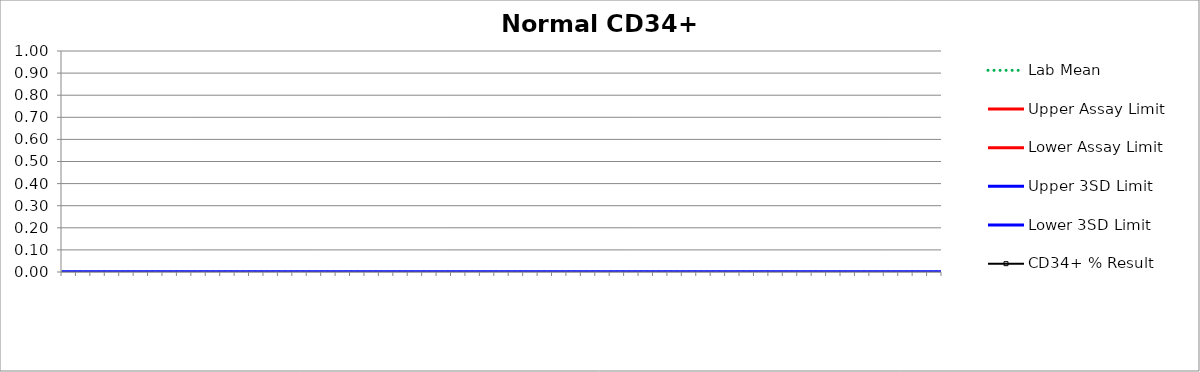
| Category | Lab Mean | Upper Assay Limit | Lower Assay Limit | Upper 3SD Limit | Lower 3SD Limit | CD34+ % Result |
|---|---|---|---|---|---|---|
|  | 0 |  |  | 0 | 0 |  |
|  | 0 |  |  | 0 | 0 |  |
|  | 0 |  |  | 0 | 0 |  |
|  | 0 |  |  | 0 | 0 |  |
|  | 0 |  |  | 0 | 0 |  |
|  | 0 |  |  | 0 | 0 |  |
|  | 0 |  |  | 0 | 0 |  |
|  | 0 |  |  | 0 | 0 |  |
|  | 0 |  |  | 0 | 0 |  |
|  | 0 |  |  | 0 | 0 |  |
|  | 0 |  |  | 0 | 0 |  |
|  | 0 |  |  | 0 | 0 |  |
|  | 0 |  |  | 0 | 0 |  |
|  | 0 |  |  | 0 | 0 |  |
|  | 0 |  |  | 0 | 0 |  |
|  | 0 |  |  | 0 | 0 |  |
|  | 0 |  |  | 0 | 0 |  |
|  | 0 |  |  | 0 | 0 |  |
|  | 0 |  |  | 0 | 0 |  |
|  | 0 |  |  | 0 | 0 |  |
|  | 0 |  |  | 0 | 0 |  |
|  | 0 |  |  | 0 | 0 |  |
|  | 0 |  |  | 0 | 0 |  |
|  | 0 |  |  | 0 | 0 |  |
|  | 0 |  |  | 0 | 0 |  |
|  | 0 |  |  | 0 | 0 |  |
|  | 0 |  |  | 0 | 0 |  |
|  | 0 |  |  | 0 | 0 |  |
|  | 0 |  |  | 0 | 0 |  |
|  | 0 |  |  | 0 | 0 |  |
|  | 0 |  |  | 0 | 0 |  |
|  | 0 |  |  | 0 | 0 |  |
|  | 0 |  |  | 0 | 0 |  |
|  | 0 |  |  | 0 | 0 |  |
|  | 0 |  |  | 0 | 0 |  |
|  | 0 |  |  | 0 | 0 |  |
|  | 0 |  |  | 0 | 0 |  |
|  | 0 |  |  | 0 | 0 |  |
|  | 0 |  |  | 0 | 0 |  |
|  | 0 |  |  | 0 | 0 |  |
|  | 0 |  |  | 0 | 0 |  |
|  | 0 |  |  | 0 | 0 |  |
|  | 0 |  |  | 0 | 0 |  |
|  | 0 |  |  | 0 | 0 |  |
|  | 0 |  |  | 0 | 0 |  |
|  | 0 |  |  | 0 | 0 |  |
|  | 0 |  |  | 0 | 0 |  |
|  | 0 |  |  | 0 | 0 |  |
|  | 0 |  |  | 0 | 0 |  |
|  | 0 |  |  | 0 | 0 |  |
|  | 0 |  |  | 0 | 0 |  |
|  | 0 |  |  | 0 | 0 |  |
|  | 0 |  |  | 0 | 0 |  |
|  | 0 |  |  | 0 | 0 |  |
|  | 0 |  |  | 0 | 0 |  |
|  | 0 |  |  | 0 | 0 |  |
|  | 0 |  |  | 0 | 0 |  |
|  | 0 |  |  | 0 | 0 |  |
|  | 0 |  |  | 0 | 0 |  |
|  | 0 |  |  | 0 | 0 |  |
|  | 0 |  |  | 0 | 0 |  |
|  | 0 |  |  | 0 | 0 |  |